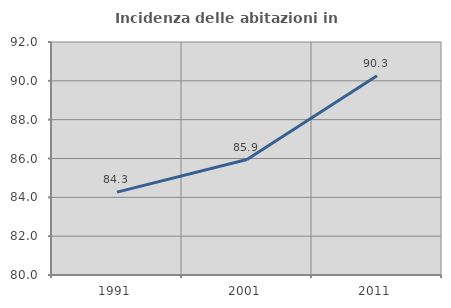
| Category | Incidenza delle abitazioni in proprietà  |
|---|---|
| 1991.0 | 84.27 |
| 2001.0 | 85.946 |
| 2011.0 | 90.256 |